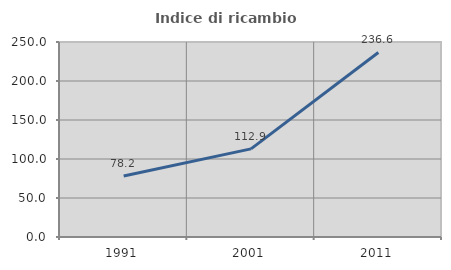
| Category | Indice di ricambio occupazionale  |
|---|---|
| 1991.0 | 78.165 |
| 2001.0 | 112.941 |
| 2011.0 | 236.628 |